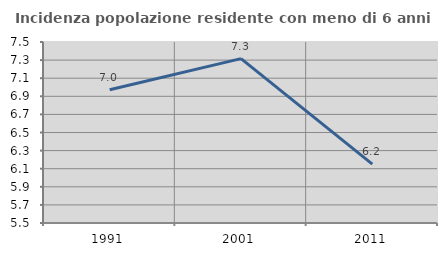
| Category | Incidenza popolazione residente con meno di 6 anni |
|---|---|
| 1991.0 | 6.972 |
| 2001.0 | 7.316 |
| 2011.0 | 6.151 |